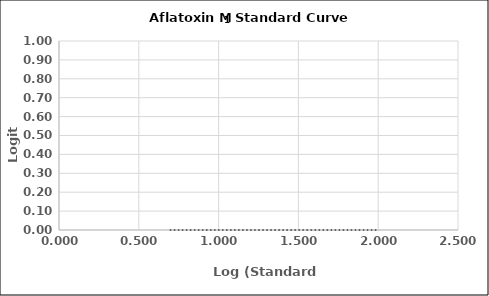
| Category | Series 0 |
|---|---|
| 0.6989700043360189 | 0 |
| 1.0 | 0 |
| 1.3979400086720377 | 0 |
| 1.6989700043360187 | 0 |
| 2.0 | 0 |